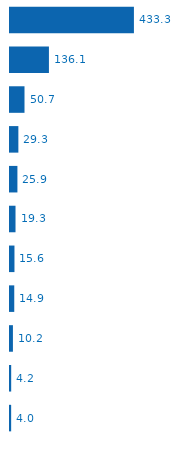
| Category | Requirement |
|---|---|
| Camp Coord. & Mgmt. | 433301840 |
| Food Security | 136120596 |
| Nutrition | 50710861 |
| WASH | 29268216 |
| Logistics | 25920776 |
| Early Recovery | 19283395 |
| Health | 15625091 |
| Shelter | 14899486 |
| Protection | 10233095 |
| Education | 4150267 |
| Emergency Telecom. | 4032356 |